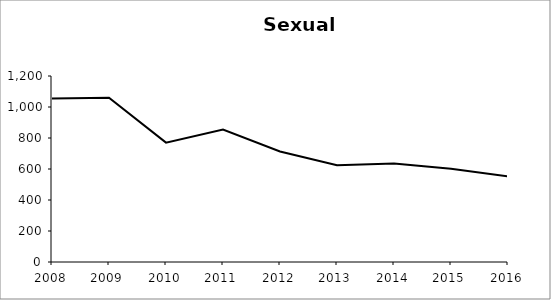
| Category | Series 0 |
|---|---|
| 2008.0 | 1055 |
| 2009.0 | 1060 |
| 2010.0 | 770 |
| 2011.0 | 854 |
| 2012.0 | 713 |
| 2013.0 | 625 |
| 2014.0 | 635 |
| 2015.0 | 602 |
| 2016.0 | 553 |